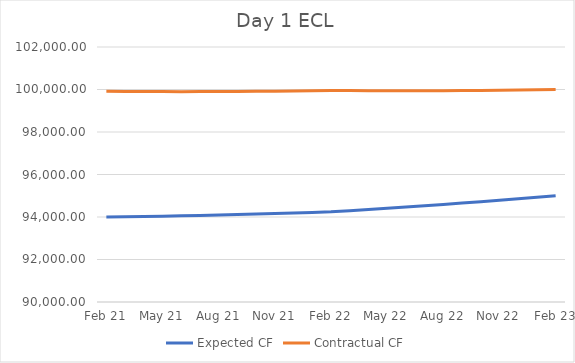
| Category | Expected CF | Contractual CF |
|---|---|---|
| 2021-02-01 | 94000 | 99913.324 |
| 2021-03-01 | 94010.488 | 99907.836 |
| 2021-04-01 | 94023.677 | 99903.43 |
| 2021-05-01 | 94038.018 | 99900.842 |
| 2021-06-01 | 94054.474 | 99899.907 |
| 2021-07-01 | 94071.98 | 99900.694 |
| 2021-08-01 | 94091.729 | 99903.26 |
| 2021-09-01 | 94113.162 | 99907.617 |
| 2021-10-01 | 94135.515 | 99913.544 |
| 2021-11-01 | 94160.283 | 99921.446 |
| 2021-12-01 | 94185.867 | 99930.818 |
| 2022-01-01 | 94213.997 | 99942.293 |
| 2022-02-01 | 94243.847 | 99955.595 |
| 2022-03-01 | 94293.618 | 99950.268 |
| 2022-04-01 | 94350.292 | 99946.039 |
| 2022-05-01 | 94406.73 | 99943.624 |
| 2022-06-01 | 94466.68 | 99942.869 |
| 2022-07-01 | 94526.291 | 99943.829 |
| 2022-08-01 | 94589.552 | 99946.576 |
| 2022-09-01 | 94654.493 | 99951.114 |
| 2022-10-01 | 94718.963 | 99957.218 |
| 2022-11-01 | 94787.247 | 99965.303 |
| 2022-12-01 | 94854.957 | 99974.853 |
| 2023-01-01 | 94926.621 | 99986.512 |
| 2023-02-01 | 95000 | 100000 |